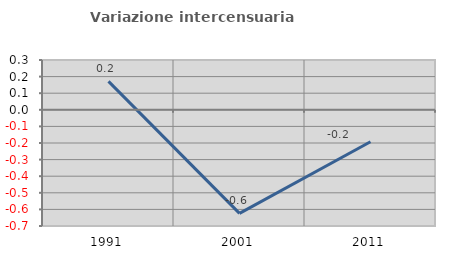
| Category | Variazione intercensuaria annua |
|---|---|
| 1991.0 | 0.171 |
| 2001.0 | -0.624 |
| 2011.0 | -0.193 |